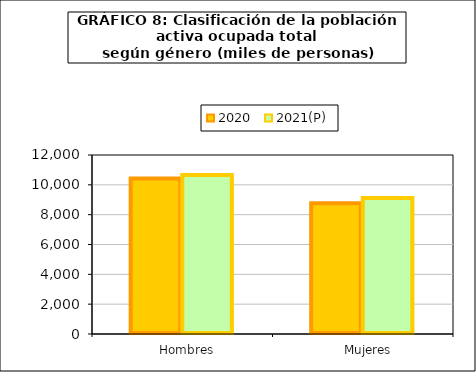
| Category | 2020 | 2021(P) |
|---|---|---|
|    Hombres | 10429.65 | 10651.725 |
|    Mujeres | 8772.75 | 9121.85 |